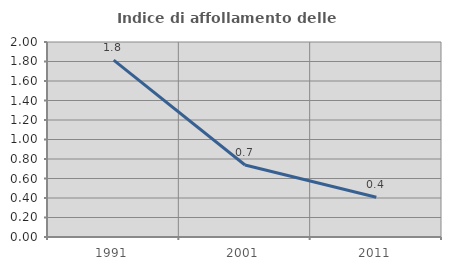
| Category | Indice di affollamento delle abitazioni  |
|---|---|
| 1991.0 | 1.813 |
| 2001.0 | 0.739 |
| 2011.0 | 0.408 |